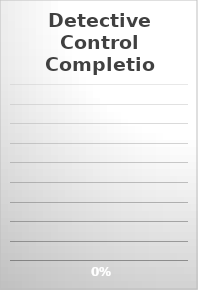
| Category | Series 0 |
|---|---|
| Detective Controls Implemented: | 0 |